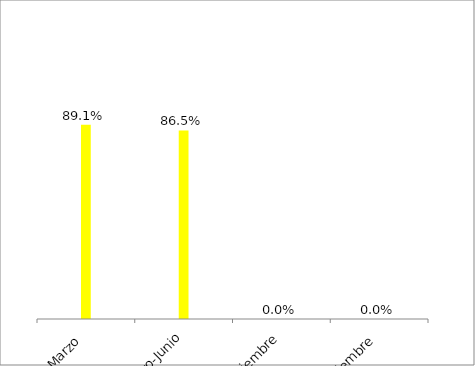
| Category | Series 3 | Series 0 | Series 1 | #REF! | Resultado | Series 5 | Series 6 |
|---|---|---|---|---|---|---|---|
| Enero-Marzo |  |  |  | 0.891 |  |  |  |
| Enero-Junio |  |  |  | 0.865 |  |  |  |
| Enero-Septiembre |  |  |  | 0 |  |  |  |
| Enero-Diciembre |  |  |  | 0 |  |  |  |